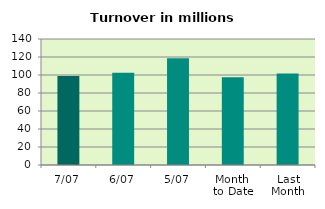
| Category | Series 0 |
|---|---|
| 7/07 | 98.95 |
| 6/07 | 102.502 |
| 5/07 | 118.733 |
| Month 
to Date | 97.6 |
| Last
Month | 101.544 |